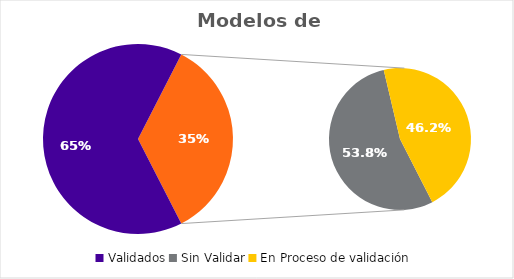
| Category | Series 0 |
|---|---|
| Validados | 121 |
| Sin Validar | 35 |
| En Proceso de validación | 30 |